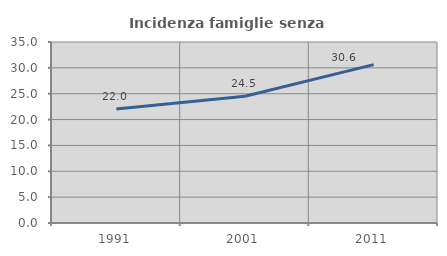
| Category | Incidenza famiglie senza nuclei |
|---|---|
| 1991.0 | 22.046 |
| 2001.0 | 24.506 |
| 2011.0 | 30.617 |